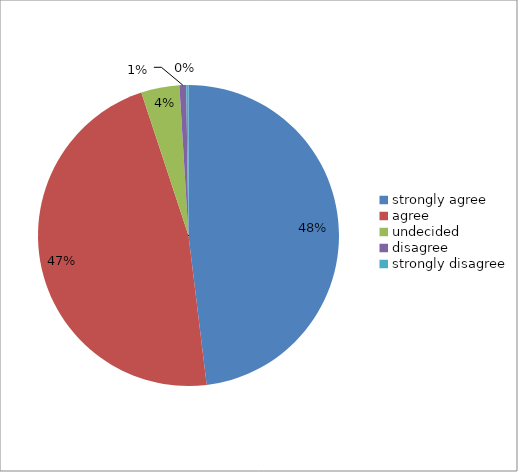
| Category | W301 Spring 2009: Overall ratings |
|---|---|
| strongly agree | 199 |
| agree | 194 |
| undecided | 17 |
| disagree | 3 |
| strongly disagree | 1 |